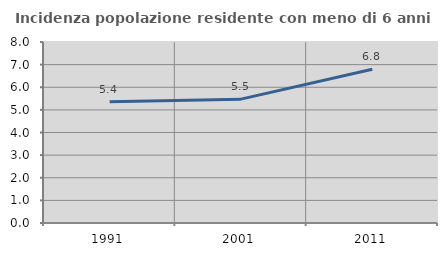
| Category | Incidenza popolazione residente con meno di 6 anni |
|---|---|
| 1991.0 | 5.364 |
| 2001.0 | 5.474 |
| 2011.0 | 6.796 |